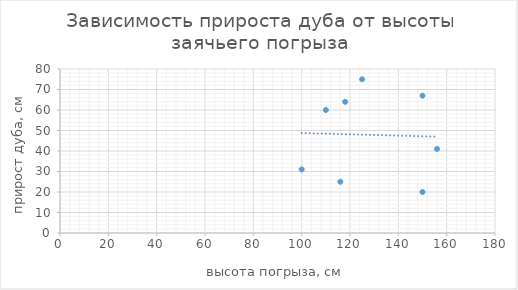
| Category | Series 0 |
|---|---|
| 156.0 | 41 |
| 118.0 | 64 |
| 150.0 | 20 |
| 100.0 | 31 |
| 150.0 | 67 |
| 116.0 | 25 |
| 110.0 | 60 |
| 125.0 | 75 |